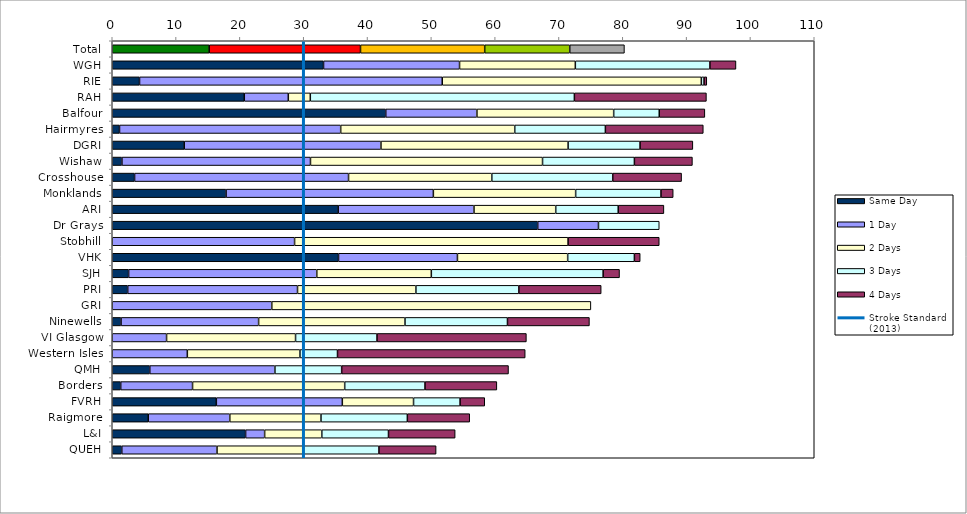
| Category | Same Day | 1 Day | 2 Days | 3 Days | 4 Days |
|---|---|---|---|---|---|
| Total | 15.192 | 23.708 | 19.463 | 13.325 | 8.568 |
| WGH | 33.107 | 21.315 | 18.141 | 21.088 | 4.082 |
| RIE | 4.274 | 47.436 | 40.598 | 0.427 | 0.427 |
| RAH | 20.69 | 6.897 | 3.448 | 41.379 | 20.69 |
| Balfour | 42.857 | 14.286 | 21.429 | 7.143 | 7.143 |
| Hairmyres | 1.136 | 34.659 | 27.273 | 14.205 | 15.341 |
| DGRI | 11.278 | 30.827 | 29.323 | 11.278 | 8.271 |
| Wishaw | 1.515 | 29.545 | 36.364 | 14.394 | 9.091 |
| Crosshouse | 3.499 | 33.528 | 22.449 | 18.95 | 10.787 |
| Monklands | 17.834 | 32.484 | 22.293 | 13.376 | 1.911 |
| ARI | 35.405 | 21.281 | 12.806 | 9.793 | 7.156 |
| Dr Grays | 66.667 | 9.524 | 0 | 9.524 | 0 |
| Stobhill | 0 | 28.571 | 42.857 | 0 | 14.286 |
| VHK | 35.455 | 18.636 | 17.273 | 10.455 | 0.909 |
| SJH | 2.564 | 29.487 | 17.949 | 26.923 | 2.564 |
| PRI | 2.419 | 26.613 | 18.548 | 16.129 | 12.903 |
| GRI | 0 | 25 | 50 | 0 | 0 |
| Ninewells | 1.376 | 21.56 | 22.936 | 16.055 | 12.844 |
| VI Glasgow | 0 | 8.511 | 20.213 | 12.766 | 23.404 |
| Western Isles | 0 | 11.765 | 17.647 | 5.882 | 29.412 |
| QMH | 5.882 | 19.608 | 0 | 10.458 | 26.144 |
| Borders | 1.325 | 11.258 | 23.841 | 12.583 | 11.258 |
| FVRH | 16.309 | 19.742 | 11.159 | 7.296 | 3.863 |
| Raigmore | 5.639 | 12.782 | 14.286 | 13.534 | 9.774 |
| L&I | 20.896 | 2.985 | 8.955 | 10.448 | 10.448 |
| QUEH | 1.493 | 14.925 | 13.433 | 11.94 | 8.955 |